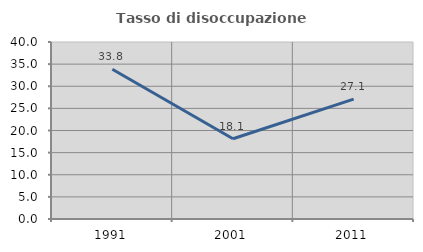
| Category | Tasso di disoccupazione giovanile  |
|---|---|
| 1991.0 | 33.835 |
| 2001.0 | 18.129 |
| 2011.0 | 27.089 |